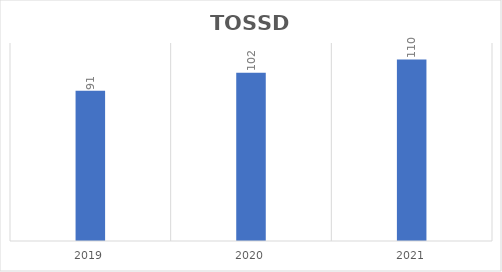
| Category | Series 0 |
|---|---|
| 2019.0 | 91 |
| 2020.0 | 102 |
| 2021.0 | 110 |